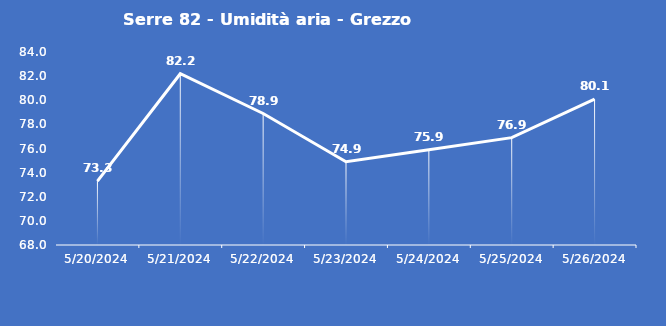
| Category | Serre 82 - Umidità aria - Grezzo (%) |
|---|---|
| 5/20/24 | 73.3 |
| 5/21/24 | 82.2 |
| 5/22/24 | 78.9 |
| 5/23/24 | 74.9 |
| 5/24/24 | 75.9 |
| 5/25/24 | 76.9 |
| 5/26/24 | 80.1 |